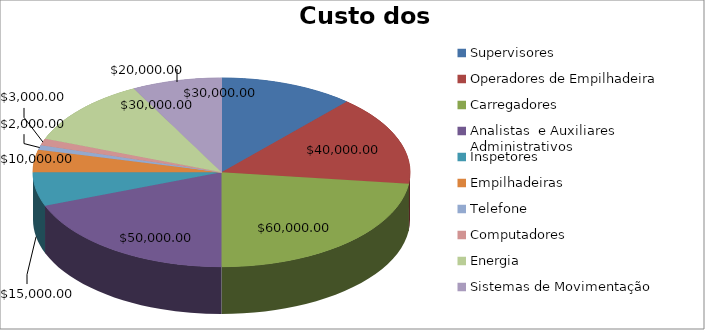
| Category | Custo dos Recursos |
|---|---|
| Supervisores | 30000 |
| Operadores de Empilhadeira | 40000 |
| Carregadores | 60000 |
| Analistas  e Auxiliares Administrativos | 50000 |
| Inspetores | 15000 |
| Empilhadeiras | 10000 |
| Telefone | 2000 |
| Computadores | 3000 |
| Energia | 30000 |
| Sistemas de Movimentação | 20000 |